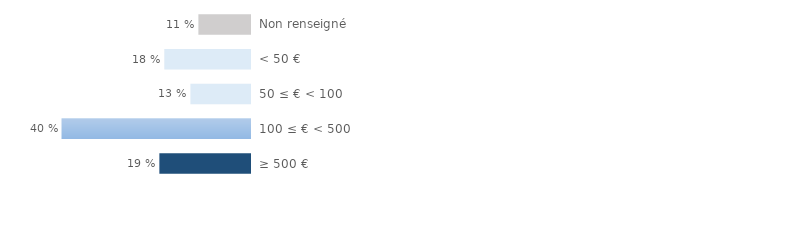
| Category | Series 0 |
|---|---|
| Non renseigné | 0.108 |
| < 50 € | 0.18 |
| 50 ≤ € < 100 | 0.125 |
| 100 ≤ € < 500 | 0.396 |
| ≥ 500 € | 0.19 |